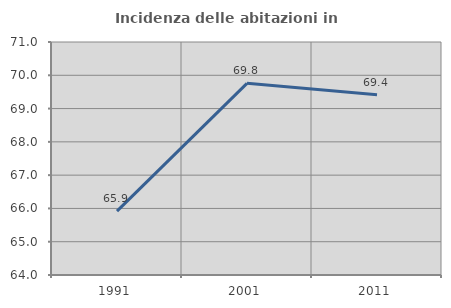
| Category | Incidenza delle abitazioni in proprietà  |
|---|---|
| 1991.0 | 65.92 |
| 2001.0 | 69.757 |
| 2011.0 | 69.414 |